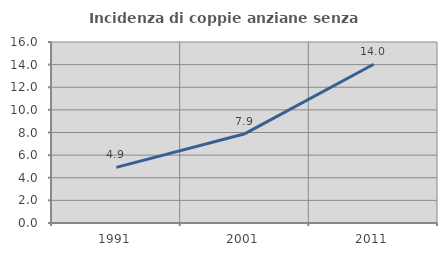
| Category | Incidenza di coppie anziane senza figli  |
|---|---|
| 1991.0 | 4.918 |
| 2001.0 | 7.895 |
| 2011.0 | 14.037 |